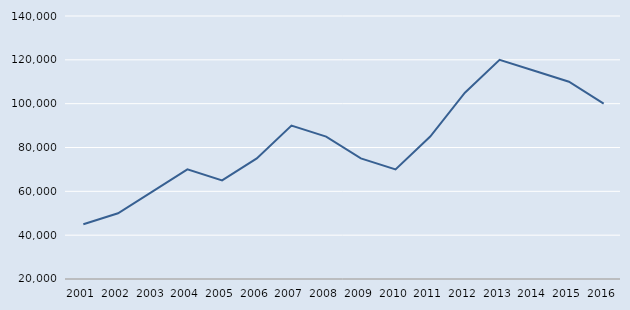
| Category | Série nova |
|---|---|
| 2001.0 | 45000 |
| 2002.0 | 50000 |
| 2003.0 | 60000 |
| 2004.0 | 70000 |
| 2005.0 | 65000 |
| 2006.0 | 75000 |
| 2007.0 | 90000 |
| 2008.0 | 85000 |
| 2009.0 | 75000 |
| 2010.0 | 70000 |
| 2011.0 | 85000 |
| 2012.0 | 105000 |
| 2013.0 | 120000 |
| 2014.0 | 115000 |
| 2015.0 | 110000 |
| 2016.0 | 100000 |